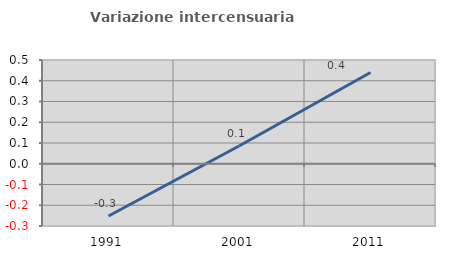
| Category | Variazione intercensuaria annua |
|---|---|
| 1991.0 | -0.252 |
| 2001.0 | 0.087 |
| 2011.0 | 0.44 |